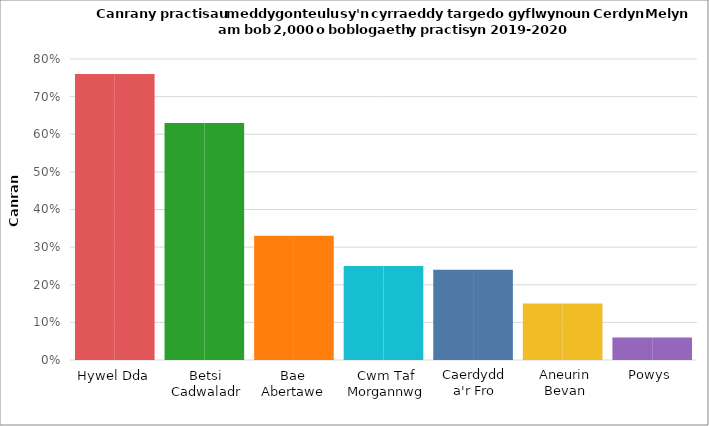
| Category | Series 1 | Series 0 |
|---|---|---|
| Hywel Dda | 0.76 | 0.76 |
| Betsi Cadwaladr | 0.63 | 0.63 |
| Swansea Bay | 0.33 | 0.33 |
| Cwm Taf Morgannwg | 0.25 | 0.25 |
| Cardiff and Vale | 0.24 | 0.24 |
| Aneurin Bevan | 0.15 | 0.15 |
| Powys | 0.06 | 0.06 |